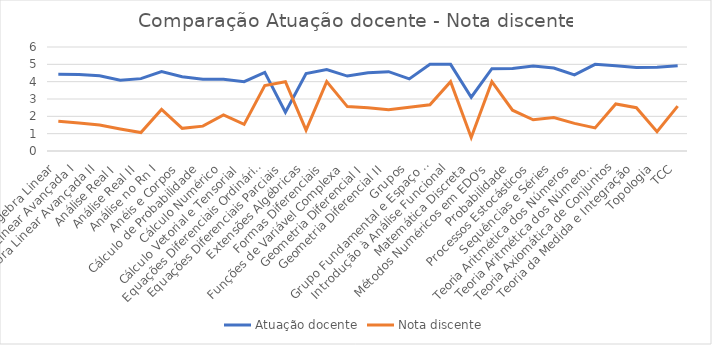
| Category | Atuação docente | Nota discente |
|---|---|---|
| Álgebra Linear | 4.424 | 1.72 |
| Álgebra Linear Avançada I | 4.407 | 1.618 |
| Álgebra Linear Avançada II | 4.34 | 1.5 |
| Análise Real I | 4.083 | 1.271 |
| Análise Real II | 4.175 | 1.067 |
| Análise no Rn I | 4.578 | 2.4 |
| Anéis e Corpos | 4.283 | 1.308 |
| Cálculo de Probabilidade | 4.133 | 1.435 |
| Cálculo Numérico | 4.137 | 2.087 |
| Cálculo Vetorial e Tensorial | 3.996 | 1.536 |
| Equações Diferenciais Ordinárias | 4.533 | 3.778 |
| Equações Diferenciais Parciais | 2.24 | 4 |
| Extensões Algébricas | 4.467 | 1.2 |
| Formas Diferenciais | 4.7 | 4 |
| Funções de Variável Complexa | 4.323 | 2.562 |
| Geometria Diferencial I | 4.52 | 2.5 |
| Geometria Diferencial II | 4.575 | 2.375 |
| Grupos | 4.16 | 2.529 |
| Grupo Fundamental e Espaço de Recobrimento | 5 | 2.667 |
| Introdução à Análise Funcional | 5 | 4 |
| Matemática Discreta | 3.103 | 0.78 |
| Métodos Numéricos em EDO's | 4.75 | 4 |
| Probabilidade | 4.756 | 2.353 |
| Processos Estocásticos | 4.9 | 1.8 |
| Sequências e Séries | 4.787 | 1.933 |
| Teoria Aritmética dos Números | 4.39 | 1.593 |
| Teoria Aritmética dos Números II | 5 | 1.333 |
| Teoria Axiomática de Conjuntos | 4.92 | 2.714 |
| Teoria da Medida e Integração | 4.818 | 2.5 |
| Topologia | 4.831 | 1.111 |
| TCC | 4.915 | 2.587 |